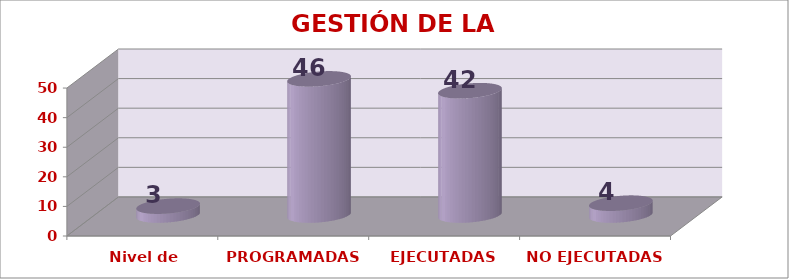
| Category | GESTIÓN DE LA COMUNIDAD |
|---|---|
| Nivel de satisfacción | 3 |
| PROGRAMADAS | 46 |
| EJECUTADAS | 42 |
| NO EJECUTADAS | 4 |